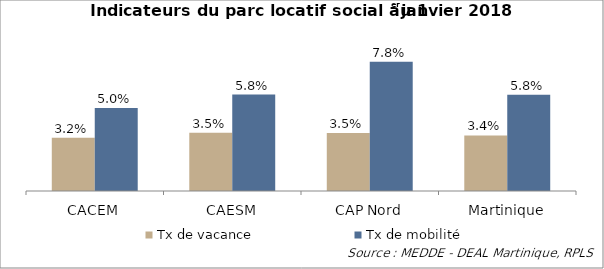
| Category | Tx de vacance | Tx de mobilité |
|---|---|---|
| CACEM | 0.032 | 0.05 |
| CAESM | 0.035 | 0.058 |
| CAP Nord | 0.035 | 0.078 |
| Martinique | 0.034 | 0.058 |